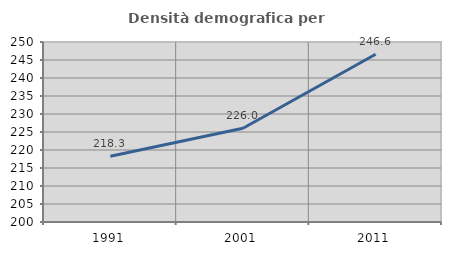
| Category | Densità demografica |
|---|---|
| 1991.0 | 218.252 |
| 2001.0 | 226.028 |
| 2011.0 | 246.609 |